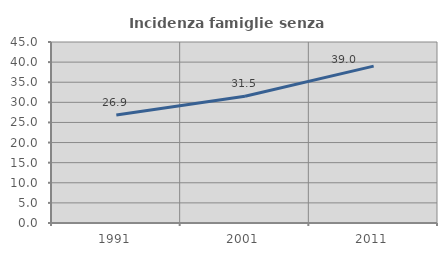
| Category | Incidenza famiglie senza nuclei |
|---|---|
| 1991.0 | 26.876 |
| 2001.0 | 31.506 |
| 2011.0 | 39.011 |